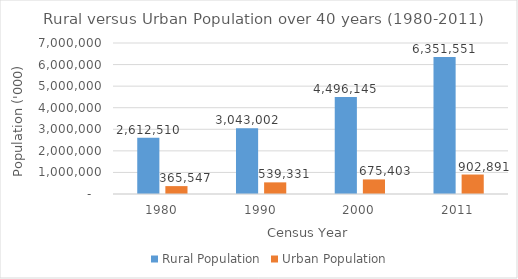
| Category | Rural Population | Urban Population |
|---|---|---|
| 1980.0 | 2612510 | 365547 |
| 1990.0 | 3043002 | 539331 |
| 2000.0 | 4496145 | 675403 |
| 2011.0 | 6351551 | 902891 |